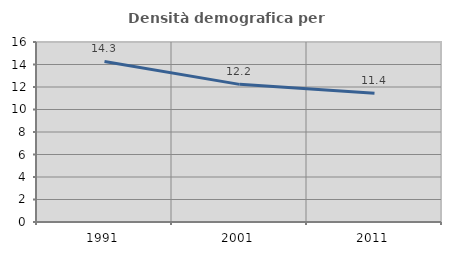
| Category | Densità demografica |
|---|---|
| 1991.0 | 14.276 |
| 2001.0 | 12.234 |
| 2011.0 | 11.443 |